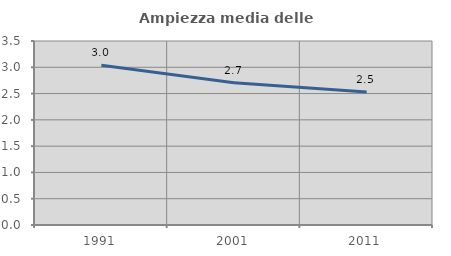
| Category | Ampiezza media delle famiglie |
|---|---|
| 1991.0 | 3.04 |
| 2001.0 | 2.705 |
| 2011.0 | 2.53 |